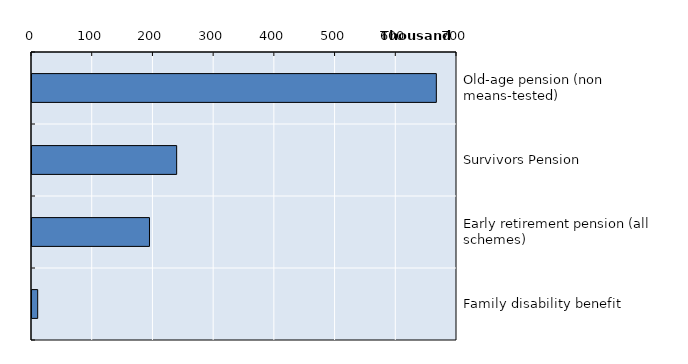
| Category | Series 0 |
|---|---|
| Old-age pension (non means-tested) | 665959 |
| Survivors Pension | 238269 |
| Early retirement pension (all schemes) | 193492 |
| Family disability benefit | 9371 |